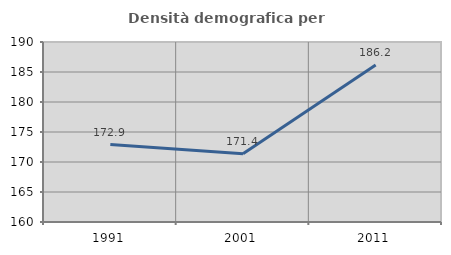
| Category | Densità demografica |
|---|---|
| 1991.0 | 172.908 |
| 2001.0 | 171.374 |
| 2011.0 | 186.157 |